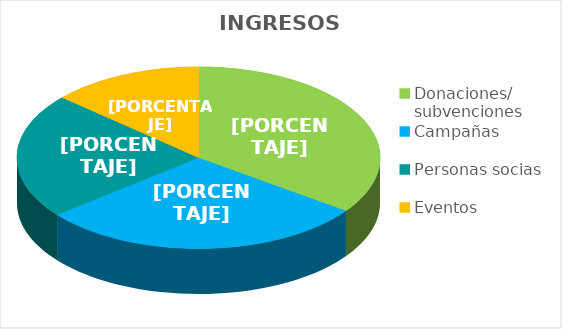
| Category | Series 0 |
|---|---|
| Donaciones/ subvenciones | 2107.89 |
| Campañas | 1761.39 |
| Personas socias | 1345.99 |
| Eventos | 816.27 |